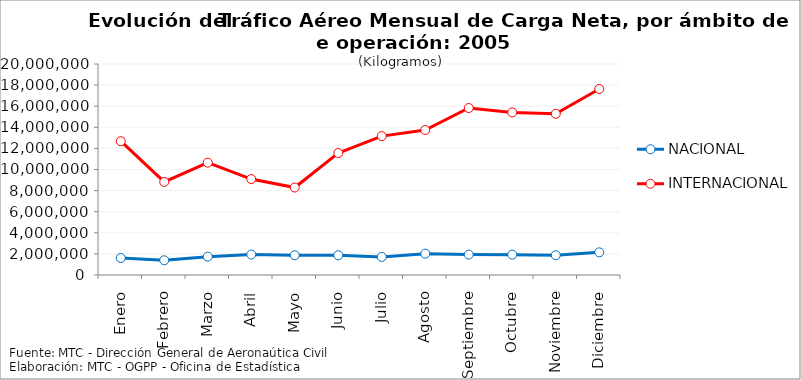
| Category | NACIONAL | INTERNACIONAL |
|---|---|---|
| Enero | 1614301 | 12683272 |
| Febrero | 1396037 | 8824167 |
| Marzo | 1740100 | 10648895 |
| Abril | 1938526 | 9096146 |
| Mayo | 1869847 | 8290917 |
| Junio | 1865891 | 11560320 |
| Julio | 1716511 | 13163880 |
| Agosto | 2023892 | 13743207 |
| Septiembre | 1934878 | 15827717 |
| Octubre | 1931273 | 15412089 |
| Noviembre | 1875441 | 15281803 |
| Diciembre | 2147216 | 17630069 |